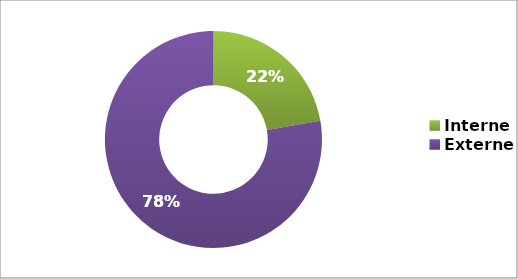
| Category | Series 0 |
|---|---|
| Interne | 0.222 |
| Externe | 0.778 |